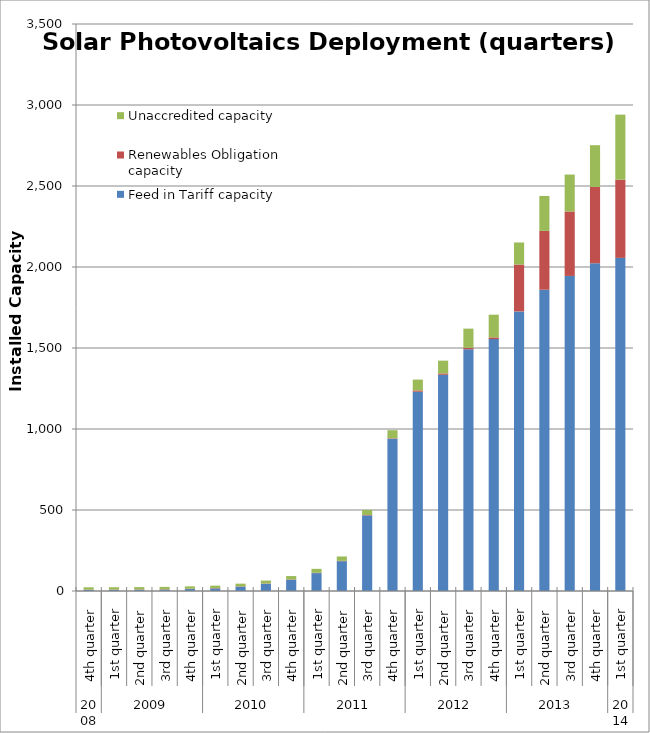
| Category | Feed in Tariff capacity | Renewables Obligation capacity | Unaccredited capacity |
|---|---|---|---|
| 0 | 6.33 | 1.958 | 14.6 |
| 1 | 6.868 | 1.963 | 14.6 |
| 2 | 7.562 | 1.992 | 14.6 |
| 3 | 8.78 | 2.021 | 14.6 |
| 4 | 12.059 | 2.04 | 14.6 |
| 5 | 15.772 | 2.073 | 15.126 |
| 6 | 26.82 | 2.124 | 16.361 |
| 7 | 44.042 | 2.156 | 18.221 |
| 8 | 69.384 | 2.189 | 20.775 |
| 9 | 110.37 | 2.206 | 24.149 |
| 10 | 183.839 | 2.285 | 26.958 |
| 11 | 466.588 | 2.385 | 31.626 |
| 12 | 940.328 | 2.71 | 49.597 |
| 13 | 1229.95 | 8.354 | 66.774 |
| 14 | 1334.674 | 8.599 | 78.661 |
| 15 | 1491.996 | 9.226 | 118.416 |
| 16 | 1554.882 | 10.595 | 140.14 |
| 17 | 1725.949 | 289.217 | 136.219 |
| 18 | 1859.758 | 363.138 | 215.745 |
| 19 | 1944.846 | 397.892 | 227.94 |
| 20 | 2023.142 | 471.065 | 257.659 |
| 21 | 2056.177 | 482.925 | 401.524 |